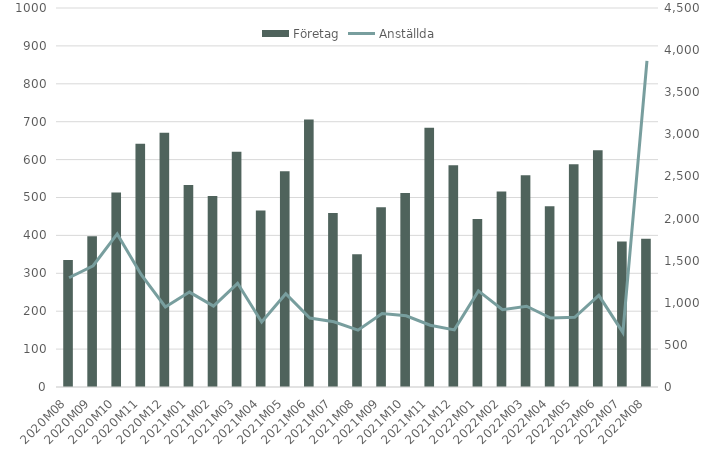
| Category | Företag |
|---|---|
| 2020M08 | 335 |
| 2020M09 | 398 |
| 2020M10 | 513 |
| 2020M11 | 642 |
| 2020M12 | 671 |
| 2021M01 | 533 |
| 2021M02 | 504 |
| 2021M03 | 621 |
| 2021M04 | 466 |
| 2021M05 | 569 |
| 2021M06 | 706 |
| 2021M07 | 459 |
| 2021M08 | 350 |
| 2021M09 | 474 |
| 2021M10 | 512 |
| 2021M11 | 684 |
| 2021M12 | 585 |
| 2022M01 | 443 |
| 2022M02 | 516 |
| 2022M03 | 559 |
| 2022M04 | 477 |
| 2022M05 | 588 |
| 2022M06 | 625 |
| 2022M07 | 384 |
| 2022M08 | 391 |